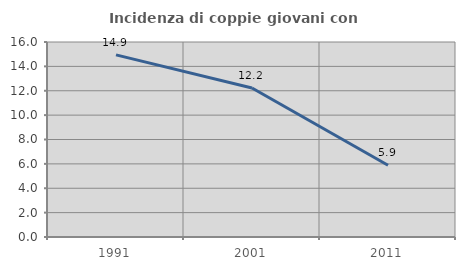
| Category | Incidenza di coppie giovani con figli |
|---|---|
| 1991.0 | 14.943 |
| 2001.0 | 12.222 |
| 2011.0 | 5.882 |